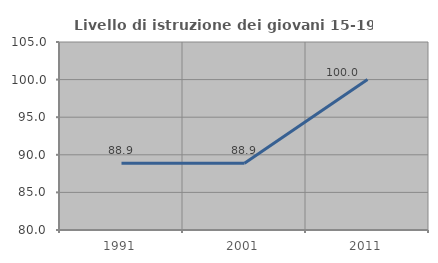
| Category | Livello di istruzione dei giovani 15-19 anni |
|---|---|
| 1991.0 | 88.889 |
| 2001.0 | 88.889 |
| 2011.0 | 100 |